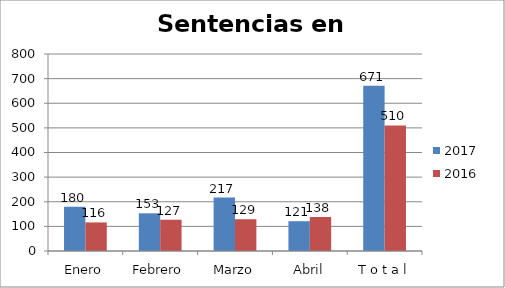
| Category | 2017 | 2016 |
|---|---|---|
| Enero | 180 | 116 |
| Febrero | 153 | 127 |
| Marzo | 217 | 129 |
| Abril | 121 | 138 |
| T o t a l | 671 | 510 |